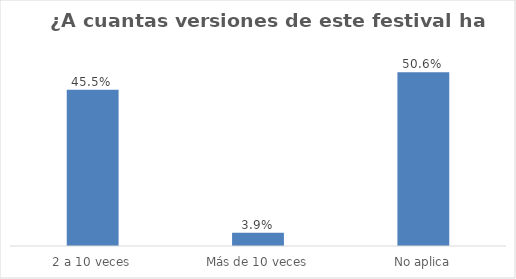
| Category | Series 0 |
|---|---|
| 2 a 10 veces | 0.455 |
| Más de 10 veces | 0.039 |
| No aplica | 0.506 |